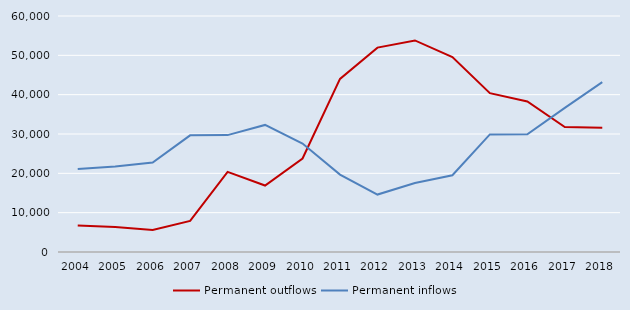
| Category | Permanent outflows | Permanent inflows |
|---|---|---|
| 2004.0 | 6757 | 21093 |
| 2005.0 | 6360 | 21741 |
| 2006.0 | 5600 | 22741 |
| 2007.0 | 7890 | 29661 |
| 2008.0 | 20357 | 29718 |
| 2009.0 | 16899 | 32307 |
| 2010.0 | 23760 | 27575 |
| 2011.0 | 43998 | 19667 |
| 2012.0 | 51958 | 14606 |
| 2013.0 | 53786 | 17554 |
| 2014.0 | 49572 | 19516 |
| 2015.0 | 40377 | 29896 |
| 2016.0 | 38273 | 29925 |
| 2017.0 | 31753 | 36639 |
| 2018.0 | 31600 | 43170 |